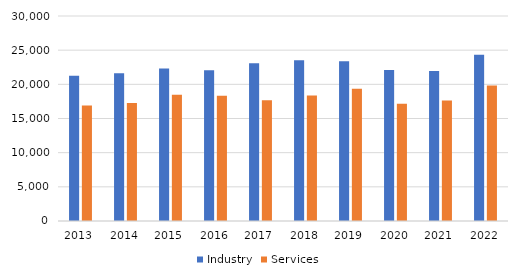
| Category | Industry | Services |
|---|---|---|
| 2013 | 21268 | 16909 |
| 2014 | 21635 | 17273 |
| 2015 | 22318 | 18482 |
| 2016 | 22065 | 18333 |
| 2017 | 23072 | 17689 |
| 2018 | 23532 | 18377 |
| 2019 | 23373 | 19340 |
| 2020 | 22103 | 17171 |
| 2021 | 21969 | 17635 |
| 2022 | 24340 | 19826 |